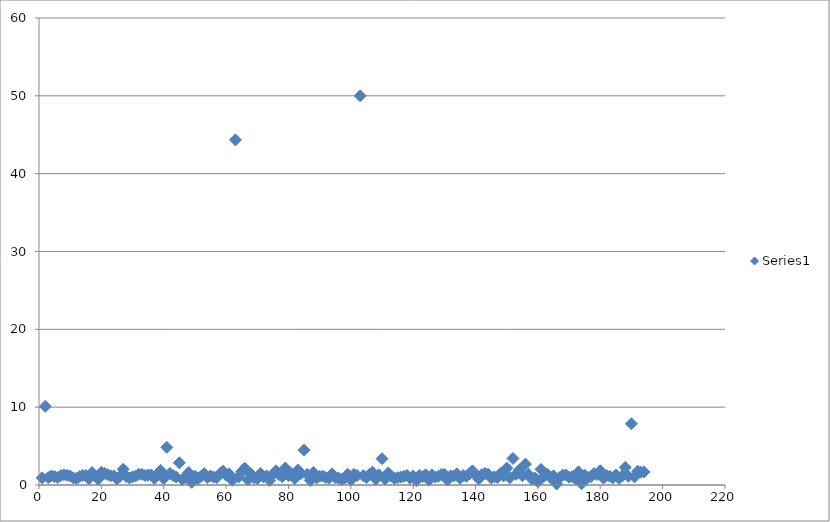
| Category | Series 0 |
|---|---|
| 0 | 0.918 |
| 1 | 10.105 |
| 2 | 0.949 |
| 3 | 1.164 |
| 4 | 1.091 |
| 5 | 0.961 |
| 6 | 1.214 |
| 7 | 1.32 |
| 8 | 1.24 |
| 9 | 1.161 |
| 10 | 0.911 |
| 11 | 0.855 |
| 12 | 1.08 |
| 13 | 1.215 |
| 14 | 1.23 |
| 15 | 0.82 |
| 16 | 1.604 |
| 17 | 1.146 |
| 18 | 0.757 |
| 19 | 1.635 |
| 20 | 1.505 |
| 21 | 1.325 |
| 22 | 1.17 |
| 23 | 1.161 |
| 24 | 0.804 |
| 25 | 1.118 |
| 26 | 2.02 |
| 27 | 1.09 |
| 28 | 0.902 |
| 29 | 1.039 |
| 30 | 1.165 |
| 31 | 1.36 |
| 32 | 1.376 |
| 33 | 1.215 |
| 34 | 1.265 |
| 35 | 1.294 |
| 36 | 0.871 |
| 37 | 1.368 |
| 38 | 1.873 |
| 39 | 0.827 |
| 40 | 4.836 |
| 41 | 1.482 |
| 42 | 1.223 |
| 43 | 1.025 |
| 44 | 2.858 |
| 45 | 0.729 |
| 46 | 1.002 |
| 47 | 1.599 |
| 48 | 0.346 |
| 49 | 1.12 |
| 50 | 0.828 |
| 51 | 1.111 |
| 52 | 1.449 |
| 53 | 0.974 |
| 54 | 1.174 |
| 55 | 1.018 |
| 56 | 0.948 |
| 57 | 1.45 |
| 58 | 1.772 |
| 59 | 1.261 |
| 60 | 1.414 |
| 61 | 0.615 |
| 62 | 44.339 |
| 63 | 1.033 |
| 64 | 1.705 |
| 65 | 2.152 |
| 66 | 0.689 |
| 67 | 1.402 |
| 68 | 0.927 |
| 69 | 0.823 |
| 70 | 1.486 |
| 71 | 1.046 |
| 72 | 1.162 |
| 73 | 0.586 |
| 74 | 1.357 |
| 75 | 1.824 |
| 76 | 1.335 |
| 77 | 1.083 |
| 78 | 2.187 |
| 79 | 1.218 |
| 80 | 1.428 |
| 81 | 0.85 |
| 82 | 1.926 |
| 83 | 1.47 |
| 84 | 4.487 |
| 85 | 1.358 |
| 86 | 0.586 |
| 87 | 1.614 |
| 88 | 0.913 |
| 89 | 1.123 |
| 90 | 1.144 |
| 91 | 0.961 |
| 92 | 0.87 |
| 93 | 1.428 |
| 94 | 0.955 |
| 95 | 0.907 |
| 96 | 0.756 |
| 97 | 0.876 |
| 98 | 1.37 |
| 99 | 0.635 |
| 100 | 1.368 |
| 101 | 1.224 |
| 102 | 50 |
| 103 | 1.197 |
| 104 | 0.963 |
| 105 | 1.38 |
| 106 | 1.641 |
| 107 | 0.748 |
| 108 | 1.31 |
| 109 | 3.377 |
| 110 | 0.754 |
| 111 | 1.545 |
| 112 | 1.126 |
| 113 | 0.851 |
| 114 | 0.935 |
| 115 | 1.021 |
| 116 | 1.113 |
| 117 | 1.238 |
| 118 | 0.895 |
| 119 | 1.151 |
| 120 | 0.545 |
| 121 | 1.23 |
| 122 | 1.069 |
| 123 | 1.311 |
| 124 | 0.641 |
| 125 | 1.301 |
| 126 | 1.021 |
| 127 | 1.106 |
| 128 | 1.338 |
| 129 | 1.385 |
| 130 | 0.639 |
| 131 | 1.165 |
| 132 | 1.162 |
| 133 | 1.431 |
| 134 | 0.859 |
| 135 | 1.224 |
| 136 | 1.103 |
| 137 | 1.469 |
| 138 | 1.814 |
| 139 | 1.334 |
| 140 | 0.775 |
| 141 | 1.327 |
| 142 | 1.491 |
| 143 | 1.38 |
| 144 | 0.919 |
| 145 | 1.052 |
| 146 | 0.976 |
| 147 | 1.485 |
| 148 | 1.168 |
| 149 | 2.172 |
| 150 | 0.938 |
| 151 | 3.411 |
| 152 | 1.369 |
| 153 | 1.911 |
| 154 | 1.194 |
| 155 | 2.689 |
| 156 | 1.365 |
| 157 | 0.774 |
| 158 | 0.895 |
| 159 | 0.433 |
| 160 | 2.004 |
| 161 | 1.135 |
| 162 | 1.375 |
| 163 | 0.949 |
| 164 | 1.178 |
| 165 | 0.142 |
| 166 | 0.961 |
| 167 | 1.269 |
| 168 | 1.271 |
| 169 | 1.018 |
| 170 | 1.079 |
| 171 | 0.842 |
| 172 | 1.688 |
| 173 | 0.169 |
| 174 | 1.257 |
| 175 | 0.965 |
| 176 | 1.064 |
| 177 | 1.472 |
| 178 | 1.343 |
| 179 | 1.835 |
| 180 | 0.885 |
| 181 | 1.202 |
| 182 | 1.125 |
| 183 | 0.913 |
| 184 | 1.294 |
| 185 | 0.853 |
| 186 | 1.136 |
| 187 | 2.253 |
| 188 | 1.121 |
| 189 | 7.873 |
| 190 | 1.037 |
| 191 | 1.78 |
| 192 | 1.651 |
| 193 | 1.683 |